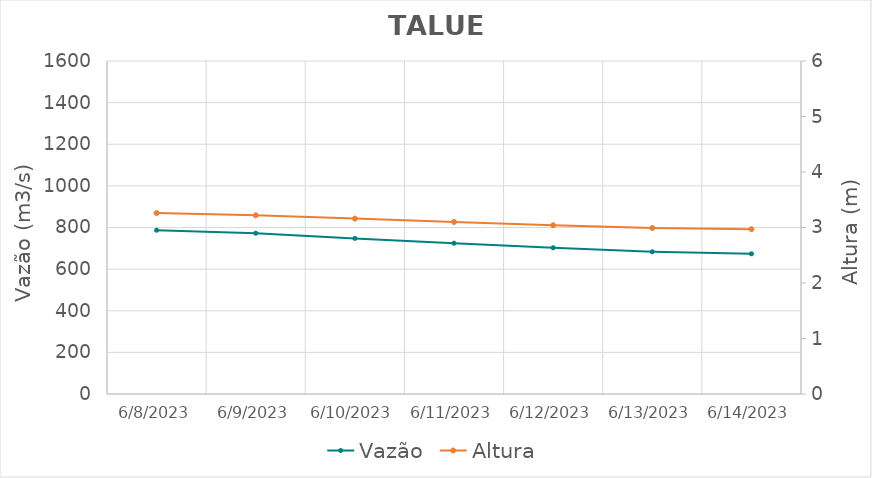
| Category | Vazão |
|---|---|
| 4/26/22 | 1550.77 |
| 4/25/22 | 1513.85 |
| 4/24/22 | 1449.65 |
| 4/23/22 | 1390 |
| 4/22/22 | 1337.8 |
| 4/21/22 | 1255.85 |
| 4/20/22 | 1234.26 |